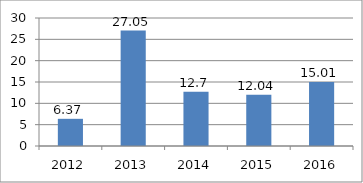
| Category | Series 0 |
|---|---|
| 2012.0 | 6.37 |
| 2013.0 | 27.05 |
| 2014.0 | 12.7 |
| 2015.0 | 12.04 |
| 2016.0 | 15.01 |